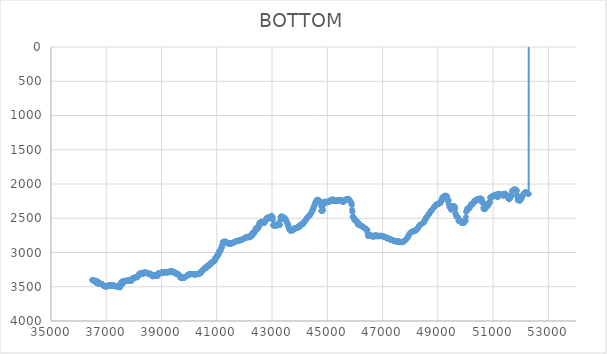
| Category | BOTTOM |
|---|---|
| 36490.3511 | 3402.52 |
| 36497.4849 | 3402.52 |
| 36507.7244 | 3402.52 |
| 36517.9645 | 3402.52 |
| 36528.2046 | 3402.56 |
| 36538.4447 | 3404.14 |
| 36548.6848 | 3412.41 |
| 36558.9249 | 3414.06 |
| 36569.165 | 3424.77 |
| 36579.4051 | 3413.79 |
| 36589.6452 | 3413.85 |
| 36599.8853 | 3416.64 |
| 36610.1254 | 3418.04 |
| 36620.3655 | 3419.21 |
| 36630.6056 | 3411.76 |
| 36640.8457 | 3443.41 |
| 36651.0857 | 3446.2 |
| 36661.3258 | 3447.57 |
| 36671.5659 | 3447.16 |
| 36681.806 | 3430.44 |
| 36692.0461 | 3421.62 |
| 36702.2862 | 3452.75 |
| 36712.5263 | 3435.38 |
| 36722.7664 | 3454.61 |
| 36733.0065 | 3454.57 |
| 36743.2466 | 3453.23 |
| 36753.4867 | 3454.33 |
| 36763.7268 | 3443.66 |
| 36773.9669 | 3456.01 |
| 36784.207 | 3456.05 |
| 36794.4471 | 3457.42 |
| 36804.6871 | 3457.49 |
| 36814.9272 | 3460.24 |
| 36825.1673 | 3460.31 |
| 36835.4074 | 3463.05 |
| 36845.6475 | 3463.12 |
| 36855.8876 | 3465.9 |
| 36866.1277 | 3467.62 |
| 36876.3678 | 3481.35 |
| 36886.6079 | 3481.52 |
| 36896.848 | 3488.29 |
| 36907.0881 | 3484.2 |
| 36917.3282 | 3485.64 |
| 36927.5683 | 3488.39 |
| 36937.8084 | 3488.46 |
| 36948.0484 | 3491.24 |
| 36958.2885 | 3492.68 |
| 36968.5286 | 3495.46 |
| 36978.7687 | 3496.87 |
| 36989.0088 | 3498.35 |
| 36999.2489 | 3502.22 |
| 37009.489 | 3492.65 |
| 37019.7291 | 3493.92 |
| 37029.9692 | 3489.76 |
| 37040.2093 | 3488.35 |
| 37050.4494 | 3486.95 |
| 37060.6895 | 3485.57 |
| 37070.9296 | 3485.54 |
| 37081.1697 | 3484.17 |
| 37091.4097 | 3484.13 |
| 37101.6498 | 3482.72 |
| 37111.8899 | 3481.35 |
| 37122.13 | 3481.32 |
| 37132.3701 | 3479.94 |
| 37142.6102 | 3479.94 |
| 37152.8503 | 3479.94 |
| 37163.0904 | 3479.94 |
| 37173.3305 | 3479.94 |
| 37183.5706 | 3479.98 |
| 37193.8107 | 3481.35 |
| 37204.0508 | 3481.35 |
| 37214.2909 | 3481.39 |
| 37224.531 | 3482.76 |
| 37234.771 | 3482.76 |
| 37245.0111 | 3482.72 |
| 37255.2512 | 3481.42 |
| 37265.4913 | 3484.13 |
| 37275.7314 | 3482.76 |
| 37285.9715 | 3482.76 |
| 37296.2116 | 3482.94 |
| 37306.4517 | 3489.83 |
| 37316.6918 | 3491.24 |
| 37326.9319 | 3492.51 |
| 37337.172 | 3488.42 |
| 37347.4121 | 3489.83 |
| 37357.6522 | 3491.24 |
| 37367.8923 | 3492.61 |
| 37378.1323 | 3492.9 |
| 37388.3724 | 3503.63 |
| 37398.6125 | 3493.98 |
| 37408.8526 | 3492.61 |
| 37419.0927 | 3492.68 |
| 37429.3328 | 3495.5 |
| 37439.5729 | 3498.28 |
| 37449.813 | 3499.72 |
| 37460.0531 | 3502.5 |
| 37470.2932 | 3503.94 |
| 37480.5333 | 3506.72 |
| 37490.7734 | 3508.13 |
| 37501.0135 | 3508.15 |
| 37511.2536 | 3455.87 |
| 37521.4936 | 3450.45 |
| 37531.7337 | 3453.2 |
| 37541.9738 | 3452.59 |
| 37552.2139 | 3429.23 |
| 37562.454 | 3427.83 |
| 37572.6941 | 3426.45 |
| 37582.9342 | 3427.17 |
| 37593.1743 | 3454.64 |
| 37603.4144 | 3455.19 |
| 37613.6545 | 3423.64 |
| 37623.8946 | 3423.64 |
| 37634.1347 | 3423.64 |
| 37644.3748 | 3423.64 |
| 37654.6149 | 3423.39 |
| 37664.8549 | 3413.79 |
| 37675.095 | 3413.79 |
| 37685.3351 | 3413.82 |
| 37695.5752 | 3415.19 |
| 37705.8153 | 3415.19 |
| 37716.0554 | 3415.16 |
| 37726.2955 | 3413.79 |
| 37736.5356 | 3413.75 |
| 37746.7757 | 3412.34 |
| 37757.0158 | 3410.97 |
| 37767.2559 | 3411.01 |
| 37777.496 | 3412.31 |
| 37787.7361 | 3409.56 |
| 37797.9762 | 3409.56 |
| 37808.2162 | 3409.6 |
| 37818.4563 | 3410.97 |
| 37828.6964 | 3410.97 |
| 37838.9365 | 3410.79 |
| 37849.1766 | 3404.08 |
| 37859.4167 | 3409.31 |
| 37869.6568 | 3399.67 |
| 37879.8969 | 3398.27 |
| 37890.137 | 3396.79 |
| 37900.3771 | 3393.32 |
| 37910.6172 | 3417.25 |
| 37920.8573 | 3388.38 |
| 37931.0974 | 3385.63 |
| 37941.3375 | 3385.6 |
| 37951.5775 | 3384.04 |
| 37961.8176 | 3377.15 |
| 37972.0577 | 3375.71 |
| 37982.2978 | 3372.96 |
| 37992.5379 | 3373.04 |
| 38002.778 | 3375.6 |
| 38013.0181 | 3368.71 |
| 38023.2582 | 3367.3 |
| 38033.4983 | 3365.89 |
| 38043.7384 | 3364.48 |
| 38053.9785 | 3363.08 |
| 38064.2186 | 3361.67 |
| 38074.4587 | 3360.3 |
| 38084.6987 | 3360.26 |
| 38094.9388 | 3358.74 |
| 38105.1789 | 3353.4 |
| 38115.419 | 3359 |
| 38125.6591 | 3362.97 |
| 38135.8992 | 3356.97 |
| 38146.1393 | 3337.77 |
| 38156.3794 | 3337.63 |
| 38166.6195 | 3332.11 |
| 38176.8596 | 3330.77 |
| 38187.0997 | 3331.49 |
| 38197.3398 | 3306.92 |
| 38207.5799 | 3311.14 |
| 38217.82 | 3315.22 |
| 38228.06 | 3313.84 |
| 38238.3001 | 3313.59 |
| 38248.5402 | 3304.06 |
| 38258.7803 | 3306.77 |
| 38269.0204 | 3305.36 |
| 38279.2605 | 3304.03 |
| 38289.5006 | 3305.47 |
| 38299.7407 | 3308.21 |
| 38309.9808 | 3308.14 |
| 38320.2209 | 3305.55 |
| 38330.461 | 3311.07 |
| 38340.7011 | 3311.92 |
| 38350.9412 | 3292.88 |
| 38361.1813 | 3298.29 |
| 38371.4213 | 3295.55 |
| 38381.6614 | 3295.47 |
| 38391.9015 | 3292.73 |
| 38402.1416 | 3292.62 |
| 38412.3817 | 3288.66 |
| 38422.6218 | 3294.14 |
| 38432.8619 | 3294.18 |
| 38443.102 | 3295.69 |
| 38453.3421 | 3301.14 |
| 38463.5822 | 3299.77 |
| 38473.8223 | 3299.88 |
| 38484.0624 | 3303.99 |
| 38494.3025 | 3303.92 |
| 38504.5426 | 3301.32 |
| 38514.7826 | 3306.92 |
| 38525.0227 | 3311.1 |
| 38535.2628 | 3313.88 |
| 38545.5029 | 3315.14 |
| 38555.743 | 3311.1 |
| 38565.9831 | 3313.66 |
| 38576.2232 | 3306.96 |
| 38586.4633 | 3312.44 |
| 38596.7034 | 3312.33 |
| 38606.9435 | 3308.47 |
| 38617.1836 | 3318.18 |
| 38627.4237 | 3322.44 |
| 38637.6638 | 3328.07 |
| 38647.9038 | 3333.81 |
| 38658.1439 | 3343.52 |
| 38668.384 | 3347.63 |
| 38678.6241 | 3347.52 |
| 38688.8642 | 3343.37 |
| 38699.1043 | 3342 |
| 38709.3444 | 3341.92 |
| 38719.5845 | 3339.11 |
| 38729.8246 | 3336.33 |
| 38740.0647 | 3334.92 |
| 38750.3048 | 3333.55 |
| 38760.5449 | 3333.55 |
| 38770.785 | 3333.51 |
| 38781.0251 | 3332.14 |
| 38791.2651 | 3332.14 |
| 38801.5052 | 3332.14 |
| 38811.7453 | 3332.14 |
| 38821.9854 | 3332.37 |
| 38832.2255 | 3340.66 |
| 38842.4656 | 3343.4 |
| 38852.7057 | 3342.51 |
| 38862.9458 | 3309.58 |
| 38873.1859 | 3308.18 |
| 38883.426 | 3306.77 |
| 38893.6661 | 3305.36 |
| 38903.9062 | 3303.99 |
| 38914.1463 | 3304.07 |
| 38924.3864 | 3306.69 |
| 38934.6264 | 3302.58 |
| 38944.8665 | 3302.58 |
| 38955.1066 | 3302.58 |
| 38965.3467 | 3302.62 |
| 38975.5868 | 3303.95 |
| 38985.8269 | 3302.25 |
| 38996.067 | 3289.95 |
| 39006.3071 | 3291.32 |
| 39016.5472 | 3291.36 |
| 39026.7873 | 3292.62 |
| 39037.0274 | 3288.66 |
| 39047.2675 | 3294.03 |
| 39057.5076 | 3289.95 |
| 39067.7476 | 3291.32 |
| 39077.9877 | 3291.32 |
| 39088.2278 | 3291.32 |
| 39098.4679 | 3291.17 |
| 39108.708 | 3285.65 |
| 39118.9481 | 3284.28 |
| 39129.1882 | 3284.47 |
| 39139.4283 | 3291.21 |
| 39149.6684 | 3286.99 |
| 39159.9085 | 3283.03 |
| 39170.1486 | 3288.58 |
| 39180.3887 | 3291.32 |
| 39190.6288 | 3291.32 |
| 39200.8689 | 3291.25 |
| 39211.1089 | 3288.51 |
| 39221.349 | 3288.55 |
| 39231.5891 | 3289.76 |
| 39241.8292 | 3284.17 |
| 39252.0693 | 3280.21 |
| 39262.3094 | 3285.62 |
| 39272.5495 | 3282.73 |
| 39282.7896 | 3277.4 |
| 39293.0297 | 3283.03 |
| 39303.2698 | 3288.47 |
| 39313.5099 | 3287.02 |
| 39323.75 | 3284.13 |
| 39333.9901 | 3278.54 |
| 39344.2301 | 3274.32 |
| 39354.4702 | 3270.21 |
| 39364.7103 | 3270.29 |
| 39374.9504 | 3273.02 |
| 39385.1905 | 3273.02 |
| 39395.4306 | 3273.44 |
| 39405.6707 | 3288.55 |
| 39415.9108 | 3289.76 |
| 39426.1509 | 3284.32 |
| 39436.391 | 3285.77 |
| 39446.6311 | 3288.47 |
| 39456.8712 | 3287.25 |
| 39467.1113 | 3292.62 |
| 39477.3514 | 3288.51 |
| 39487.5914 | 3288.62 |
| 39497.8315 | 3293.08 |
| 39508.0716 | 3305.48 |
| 39518.3117 | 3308.33 |
| 39528.5518 | 3312.4 |
| 39538.7919 | 3310.91 |
| 39549.032 | 3306.85 |
| 39559.2721 | 3308.29 |
| 39569.5122 | 3311.07 |
| 39579.7523 | 3312.48 |
| 39589.9924 | 3314.04 |
| 39600.2325 | 3320.92 |
| 39610.4726 | 3322.21 |
| 39620.7126 | 3319.63 |
| 39630.9527 | 3325.26 |
| 39641.1928 | 3331.16 |
| 39651.4329 | 3346.37 |
| 39661.673 | 3352 |
| 39671.9131 | 3357.64 |
| 39682.1532 | 3363.23 |
| 39692.3933 | 3367.45 |
| 39702.6334 | 3371.56 |
| 39712.8735 | 3371.48 |
| 39723.1136 | 3368.9 |
| 39733.3537 | 3374.37 |
| 39743.5938 | 3374.06 |
| 39753.8338 | 3363.11 |
| 39764.0739 | 3363.23 |
| 39774.314 | 3367.33 |
| 39784.5541 | 3367.33 |
| 39794.7942 | 3367.33 |
| 39805.0343 | 3367.33 |
| 39815.2744 | 3367.33 |
| 39825.5145 | 3367.25 |
| 39835.7546 | 3364.28 |
| 39845.9947 | 3361.31 |
| 39856.2348 | 3358.34 |
| 39866.4749 | 3355.37 |
| 39876.715 | 3352.39 |
| 39886.9551 | 3349.42 |
| 39897.1951 | 3346.45 |
| 39907.4352 | 3343.48 |
| 39917.6753 | 3340.51 |
| 39927.9154 | 3337.49 |
| 39938.1555 | 3334.47 |
| 39948.3956 | 3331.46 |
| 39958.6357 | 3328.44 |
| 39968.8758 | 3325.42 |
| 39979.1159 | 3322.41 |
| 39989.356 | 3319.46 |
| 39999.5961 | 3318.86 |
| 40009.8362 | 3318.25 |
| 40020.0763 | 3317.65 |
| 40030.3163 | 3317.05 |
| 40040.5564 | 3316.44 |
| 40050.7965 | 3315.84 |
| 40061.0366 | 3315.25 |
| 40071.2767 | 3315.09 |
| 40081.5168 | 3314.94 |
| 40091.7569 | 3314.78 |
| 40101.997 | 3314.62 |
| 40112.2371 | 3314.47 |
| 40122.4772 | 3314.31 |
| 40132.7173 | 3314.15 |
| 40142.9574 | 3314 |
| 40153.1975 | 3314.04 |
| 40163.4375 | 3320.73 |
| 40173.6776 | 3315.25 |
| 40183.9177 | 3315.25 |
| 40194.1578 | 3315.57 |
| 40204.3979 | 3326.47 |
| 40214.638 | 3324.83 |
| 40224.8781 | 3315.25 |
| 40235.1182 | 3315.25 |
| 40245.3583 | 3315.29 |
| 40255.5984 | 3316.7 |
| 40265.8385 | 3317.99 |
| 40276.0786 | 3315.25 |
| 40286.3187 | 3315.13 |
| 40296.5588 | 3311.07 |
| 40306.7988 | 3312.44 |
| 40317.0389 | 3312.44 |
| 40327.279 | 3312.52 |
| 40337.5191 | 3315.25 |
| 40347.7592 | 3315.29 |
| 40357.9993 | 3316.15 |
| 40368.2394 | 3298.36 |
| 40378.4795 | 3298.32 |
| 40388.7196 | 3296.87 |
| 40398.9597 | 3294.26 |
| 40409.1998 | 3298.36 |
| 40419.4399 | 3298.24 |
| 40429.68 | 3294.18 |
| 40439.92 | 3294.75 |
| 40450.1601 | 3267.35 |
| 40460.4002 | 3265.91 |
| 40470.6403 | 3263.17 |
| 40480.8804 | 3263.05 |
| 40491.1205 | 3258.95 |
| 40501.3606 | 3258.95 |
| 40511.6007 | 3258.83 |
| 40521.8408 | 3254.25 |
| 40532.0809 | 3237.75 |
| 40542.321 | 3234.94 |
| 40552.5611 | 3232.04 |
| 40562.8012 | 3226.69 |
| 40573.0412 | 3230.84 |
| 40583.2813 | 3232.16 |
| 40593.5214 | 3230.76 |
| 40603.7615 | 3229.39 |
| 40614.0016 | 3228.71 |
| 40624.2417 | 3205.34 |
| 40634.4818 | 3201.32 |
| 40644.7219 | 3204.05 |
| 40654.962 | 3203.93 |
| 40665.2021 | 3199.91 |
| 40675.4422 | 3202.6 |
| 40685.6823 | 3201.08 |
| 40695.9224 | 3195.09 |
| 40706.1624 | 3177.31 |
| 40716.4025 | 3177.23 |
| 40726.6426 | 3174.65 |
| 40736.8827 | 3180.08 |
| 40747.1228 | 3178.67 |
| 40757.3629 | 3177.35 |
| 40767.603 | 3178.55 |
| 40777.8431 | 3172.56 |
| 40788.0832 | 3154.74 |
| 40798.3233 | 3153.22 |
| 40808.5634 | 3147.63 |
| 40818.8035 | 3143.48 |
| 40829.0436 | 3141.96 |
| 40839.2836 | 3136.61 |
| 40849.5237 | 3140.75 |
| 40859.7638 | 3142 |
| 40870.0039 | 3137.57 |
| 40880.244 | 3126.47 |
| 40890.4841 | 3120.84 |
| 40900.7242 | 3115.45 |
| 40910.9643 | 3118.19 |
| 40921.2044 | 3118.31 |
| 40931.4445 | 3121.2 |
| 40941.6846 | 3080.18 |
| 40951.9247 | 3080.1 |
| 40962.1648 | 3077.41 |
| 40972.4048 | 3078.65 |
| 40982.6449 | 3074.59 |
| 40992.885 | 3075.19 |
| 41003.1251 | 3049.09 |
| 41013.3652 | 3045.11 |
| 41023.6053 | 3049.13 |
| 41033.8454 | 3045.43 |
| 41044.0855 | 3012.78 |
| 41054.3256 | 3018.37 |
| 41064.5657 | 3022.31 |
| 41074.8058 | 3017 |
| 41085.0459 | 3021.09 |
| 41095.286 | 2974.61 |
| 41105.526 | 2974.61 |
| 41115.7661 | 2974.61 |
| 41126.0062 | 2974.65 |
| 41136.2463 | 2974.84 |
| 41146.4864 | 2935.32 |
| 41156.7265 | 2939.42 |
| 41166.9666 | 2939.26 |
| 41177.2067 | 2932.69 |
| 41187.4468 | 2895.86 |
| 41197.6869 | 2898.76 |
| 41207.927 | 2902.52 |
| 41218.1671 | 2845.11 |
| 41228.4072 | 2845.11 |
| 41238.6472 | 2845.07 |
| 41248.8873 | 2843.7 |
| 41259.1274 | 2843.66 |
| 41269.3675 | 2842.33 |
| 41279.6076 | 2843.74 |
| 41289.8477 | 2844.99 |
| 41300.0878 | 2840.93 |
| 41310.3279 | 2842.38 |
| 41320.568 | 2845.11 |
| 41330.8081 | 2845.27 |
| 41341.0482 | 2850.74 |
| 41351.2883 | 2850.78 |
| 41361.5284 | 2852.19 |
| 41371.7684 | 2853.64 |
| 41382.0085 | 2856.45 |
| 41392.2486 | 2859.27 |
| 41402.4887 | 2862.08 |
| 41412.7288 | 2864.9 |
| 41422.9689 | 2867.64 |
| 41433.209 | 2867.81 |
| 41443.4491 | 2867.99 |
| 41453.6892 | 2868.16 |
| 41463.9293 | 2868.34 |
| 41474.1694 | 2868.52 |
| 41484.4095 | 2868.69 |
| 41494.6496 | 2868.87 |
| 41504.8896 | 2869.01 |
| 41515.1297 | 2868.07 |
| 41525.3698 | 2867.13 |
| 41535.6099 | 2866.2 |
| 41545.85 | 2865.26 |
| 41556.0901 | 2864.32 |
| 41566.3302 | 2863.35 |
| 41576.5703 | 2861.28 |
| 41586.8104 | 2859.22 |
| 41597.0505 | 2857.15 |
| 41607.2906 | 2855.09 |
| 41617.5307 | 2853.02 |
| 41627.7708 | 2850.96 |
| 41638.0108 | 2848.9 |
| 41648.2509 | 2846.83 |
| 41658.491 | 2844.77 |
| 41668.7311 | 2842.7 |
| 41678.9712 | 2840.64 |
| 41689.2113 | 2838.57 |
| 41699.4514 | 2836.51 |
| 41709.6915 | 2834.44 |
| 41719.9316 | 2832.42 |
| 41730.1717 | 2831.8 |
| 41740.4118 | 2831.17 |
| 41750.6519 | 2830.55 |
| 41760.892 | 2829.92 |
| 41771.132 | 2829.29 |
| 41781.3721 | 2828.67 |
| 41791.6122 | 2828.04 |
| 41801.8523 | 2827.42 |
| 41812.0924 | 2826.76 |
| 41822.3325 | 2825.22 |
| 41832.5726 | 2823.67 |
| 41842.8127 | 2822.12 |
| 41853.0528 | 2820.57 |
| 41863.2929 | 2819.02 |
| 41873.533 | 2817.47 |
| 41883.7731 | 2815.93 |
| 41894.0132 | 2814.38 |
| 41904.2532 | 2812.83 |
| 41914.4933 | 2811.25 |
| 41924.7334 | 2808.82 |
| 41934.9735 | 2806.39 |
| 41945.2136 | 2803.96 |
| 41955.4537 | 2801.53 |
| 41965.6938 | 2799.1 |
| 41975.9339 | 2796.67 |
| 41986.174 | 2794.23 |
| 41996.4141 | 2791.8 |
| 42006.6542 | 2789.37 |
| 42016.8943 | 2786.94 |
| 42027.1343 | 2784.53 |
| 42037.3744 | 2782.89 |
| 42047.6145 | 2781.25 |
| 42057.8546 | 2779.61 |
| 42068.0947 | 2777.96 |
| 42078.3348 | 2776.32 |
| 42088.5749 | 2774.85 |
| 42098.815 | 2778.99 |
| 42109.0551 | 2780.23 |
| 42119.2952 | 2776.14 |
| 42129.5353 | 2776.14 |
| 42139.7754 | 2776.14 |
| 42150.0155 | 2775.72 |
| 42160.2555 | 2762.44 |
| 42170.4956 | 2774.77 |
| 42180.7357 | 2776.14 |
| 42190.9758 | 2776.14 |
| 42201.2159 | 2776.09 |
| 42211.456 | 2774.31 |
| 42221.6961 | 2760.61 |
| 42231.9362 | 2759.2 |
| 42242.1763 | 2757.84 |
| 42252.4164 | 2757.79 |
| 42262.6565 | 2755.46 |
| 42272.8966 | 2724.98 |
| 42283.1367 | 2753.76 |
| 42293.3767 | 2712.79 |
| 42303.6168 | 2712.75 |
| 42313.8569 | 2711.3 |
| 42324.097 | 2708.74 |
| 42334.3371 | 2714.2 |
| 42344.5772 | 2714.2 |
| 42354.8173 | 2714.2 |
| 42365.0574 | 2713.4 |
| 42375.2975 | 2687.41 |
| 42385.5376 | 2685.03 |
| 42395.7777 | 2653.2 |
| 42406.0178 | 2682.47 |
| 42416.2579 | 2657.47 |
| 42426.4979 | 2644.07 |
| 42436.738 | 2652.27 |
| 42446.9781 | 2651.55 |
| 42457.2182 | 2629.01 |
| 42467.4583 | 2650.86 |
| 42477.6984 | 2650.82 |
| 42487.9385 | 2649.37 |
| 42498.1786 | 2645.96 |
| 42508.4187 | 2624.03 |
| 42518.6588 | 2621.26 |
| 42528.8989 | 2618.36 |
| 42539.139 | 2569.13 |
| 42549.379 | 2566.36 |
| 42559.6191 | 2564.91 |
| 42569.8592 | 2562.31 |
| 42580.0993 | 2566.32 |
| 42590.3394 | 2563.54 |
| 42600.5795 | 2561.84 |
| 42610.8196 | 2550.96 |
| 42621.0597 | 2552.5 |
| 42631.2998 | 2558.17 |
| 42641.5399 | 2564.91 |
| 42651.78 | 2562.18 |
| 42662.0201 | 2562.18 |
| 42672.2602 | 2562.18 |
| 42682.5002 | 2562.14 |
| 42692.7403 | 2560.9 |
| 42702.9804 | 2564.78 |
| 42713.2205 | 2558.17 |
| 42723.4606 | 2564.99 |
| 42733.7007 | 2564.1 |
| 42743.9408 | 2535.69 |
| 42754.1809 | 2543.37 |
| 42764.421 | 2527.03 |
| 42774.6611 | 2527.75 |
| 42784.9012 | 2507.97 |
| 42795.1413 | 2528.82 |
| 42805.3814 | 2497.43 |
| 42815.6214 | 2497.38 |
| 42825.8615 | 2495.98 |
| 42836.1016 | 2494.66 |
| 42846.3417 | 2495.63 |
| 42856.5818 | 2483.91 |
| 42866.8219 | 2501.61 |
| 42877.062 | 2500.2 |
| 42887.3021 | 2498.75 |
| 42897.5422 | 2496.02 |
| 42907.7823 | 2495.98 |
| 42918.0224 | 2494.61 |
| 42928.2625 | 2494.74 |
| 42938.5025 | 2498.79 |
| 42948.7426 | 2497.51 |
| 42958.9827 | 2500.24 |
| 42969.2228 | 2499.04 |
| 42979.4629 | 2462.17 |
| 42989.703 | 2504.55 |
| 42999.9431 | 2506.25 |
| 43010.1832 | 2473.84 |
| 43020.4233 | 2485.92 |
| 43030.6634 | 2525.14 |
| 43040.9035 | 2600.4 |
| 43051.1436 | 2607.22 |
| 43061.3837 | 2607.22 |
| 43071.6237 | 2607.22 |
| 43081.8638 | 2607.22 |
| 43092.1039 | 2607.35 |
| 43102.344 | 2611.14 |
| 43112.5841 | 2601.63 |
| 43122.8242 | 2603 |
| 43133.0643 | 2603.04 |
| 43143.3044 | 2604.62 |
| 43153.5445 | 2610.92 |
| 43163.7846 | 2594.47 |
| 43174.0247 | 2591.78 |
| 43184.2648 | 2593.1 |
| 43194.5048 | 2591.74 |
| 43204.7449 | 2591.78 |
| 43214.985 | 2593.1 |
| 43225.2251 | 2591.78 |
| 43235.4652 | 2593.19 |
| 43245.7053 | 2594.51 |
| 43255.9454 | 2593.23 |
| 43266.1855 | 2596 |
| 43276.4256 | 2597.41 |
| 43286.6657 | 2596.69 |
| 43296.9058 | 2529.73 |
| 43307.1459 | 2483.35 |
| 43317.386 | 2483.18 |
| 43327.626 | 2477.68 |
| 43337.8661 | 2476.31 |
| 43348.1062 | 2476.31 |
| 43358.3463 | 2476.31 |
| 43368.5864 | 2476.88 |
| 43378.8265 | 2494.83 |
| 43389.0666 | 2501.65 |
| 43399.3067 | 2501.65 |
| 43409.5468 | 2501.34 |
| 43419.7869 | 2491.8 |
| 43430.027 | 2491.75 |
| 43440.2671 | 2490.48 |
| 43450.5071 | 2493.47 |
| 43460.7472 | 2501.65 |
| 43470.9873 | 2501.91 |
| 43481.2274 | 2510.71 |
| 43491.4675 | 2529.67 |
| 43501.7076 | 2525.88 |
| 43511.9477 | 2535.38 |
| 43522.1878 | 2544.88 |
| 43532.4279 | 2554.38 |
| 43542.668 | 2563.89 |
| 43552.9081 | 2573.75 |
| 43563.1482 | 2583.6 |
| 43573.3883 | 2593.45 |
| 43583.6283 | 2603.53 |
| 43593.8684 | 2620.42 |
| 43604.1085 | 2637.09 |
| 43614.3486 | 2646.94 |
| 43624.5887 | 2656.69 |
| 43634.8288 | 2663.02 |
| 43645.0689 | 2669.35 |
| 43655.309 | 2675.69 |
| 43665.5491 | 2681.78 |
| 43675.7892 | 2680.37 |
| 43686.0293 | 2678.97 |
| 43696.2694 | 2677.56 |
| 43706.5094 | 2676.02 |
| 43716.7495 | 2670.56 |
| 43726.9896 | 2670.87 |
| 43737.2297 | 2680.24 |
| 43747.4698 | 2674.65 |
| 43757.7099 | 2670.61 |
| 43767.95 | 2671.71 |
| 43778.1901 | 2663.39 |
| 43788.4302 | 2659.26 |
| 43798.6703 | 2657.85 |
| 43808.9104 | 2656 |
| 43819.1505 | 2641.36 |
| 43829.3905 | 2652.13 |
| 43839.6306 | 2648.04 |
| 43849.8707 | 2647.91 |
| 43860.1108 | 2643.82 |
| 43870.3509 | 2643.86 |
| 43880.591 | 2645.01 |
| 43890.8311 | 2638.19 |
| 43901.0712 | 2638.14 |
| 43911.3113 | 2636.69 |
| 43921.5514 | 2633.97 |
| 43931.7915 | 2633.92 |
| 43942.0316 | 2632.51 |
| 43952.2717 | 2631.11 |
| 43962.5117 | 2629.03 |
| 43972.7518 | 2607.89 |
| 43982.9919 | 2628.38 |
| 43993.232 | 2629.03 |
| 44003.4721 | 2607.31 |
| 44013.7122 | 2610.08 |
| 44023.9523 | 2611.13 |
| 44034.1924 | 2601.59 |
| 44044.4325 | 2601.15 |
| 44054.6726 | 2587.52 |
| 44064.9127 | 2587.52 |
| 44075.1528 | 2587.52 |
| 44085.3928 | 2587.52 |
| 44095.6329 | 2587.2 |
| 44105.873 | 2577.97 |
| 44116.1131 | 2587.34 |
| 44126.3532 | 2581.39 |
| 44136.5933 | 2566.24 |
| 44146.8334 | 2561.24 |
| 44157.0735 | 2556.23 |
| 44167.3136 | 2551.23 |
| 44177.5537 | 2546.22 |
| 44187.7938 | 2541.22 |
| 44198.0339 | 2536.21 |
| 44208.2739 | 2531.21 |
| 44218.514 | 2526.2 |
| 44228.7541 | 2521.15 |
| 44238.9942 | 2514.58 |
| 44249.2343 | 2508.01 |
| 44259.4744 | 2501.44 |
| 44269.7145 | 2494.87 |
| 44279.9546 | 2488.3 |
| 44290.1947 | 2481.82 |
| 44300.4348 | 2477.91 |
| 44310.6749 | 2474 |
| 44320.915 | 2470.09 |
| 44331.1551 | 2466.18 |
| 44341.3951 | 2462.27 |
| 44351.6352 | 2458.36 |
| 44361.8753 | 2454.45 |
| 44372.1154 | 2450.54 |
| 44382.3555 | 2446.52 |
| 44392.5956 | 2439.25 |
| 44402.8357 | 2431.98 |
| 44413.0758 | 2424.7 |
| 44423.3159 | 2417.43 |
| 44433.556 | 2410.16 |
| 44443.7961 | 2402.74 |
| 44454.0362 | 2391.01 |
| 44464.2762 | 2379.28 |
| 44474.5163 | 2367.66 |
| 44484.7564 | 2359.21 |
| 44494.9965 | 2350.76 |
| 44505.2366 | 2342.32 |
| 44515.4767 | 2333.75 |
| 44525.7168 | 2321.36 |
| 44535.9569 | 2308.97 |
| 44546.197 | 2296.59 |
| 44556.4371 | 2284.2 |
| 44566.6772 | 2271.98 |
| 44576.9173 | 2264.94 |
| 44587.1573 | 2257.91 |
| 44597.3974 | 2250.87 |
| 44607.6375 | 2243.83 |
| 44617.8776 | 2236.79 |
| 44628.1177 | 2230.03 |
| 44638.3578 | 2231.62 |
| 44648.5979 | 2233.2 |
| 44658.838 | 2234.78 |
| 44669.0781 | 2236.37 |
| 44679.3182 | 2237.95 |
| 44689.5583 | 2239.53 |
| 44699.7984 | 2241.12 |
| 44710.0384 | 2242.97 |
| 44720.2785 | 2252.59 |
| 44730.5186 | 2255.23 |
| 44740.7587 | 2252.64 |
| 44750.9988 | 2256.86 |
| 44761.2389 | 2262.77 |
| 44771.479 | 2319.62 |
| 44781.7191 | 2390.59 |
| 44791.9592 | 2394.67 |
| 44802.1993 | 2394.63 |
| 44812.4394 | 2393.26 |
| 44822.6795 | 2393.26 |
| 44832.9195 | 2392.72 |
| 44843.1596 | 2374.27 |
| 44853.3997 | 2310.62 |
| 44863.6398 | 2280.47 |
| 44873.8799 | 2274.8 |
| 44884.12 | 2268.03 |
| 44894.3601 | 2269.39 |
| 44904.6002 | 2268.98 |
| 44914.8403 | 2256.82 |
| 44925.0804 | 2259.72 |
| 44935.3205 | 2265.22 |
| 44945.5606 | 2266.67 |
| 44955.8007 | 2269.3 |
| 44966.0407 | 2266.62 |
| 44976.2808 | 2267.76 |
| 44986.5209 | 2260.95 |
| 44996.761 | 2260.9 |
| 45007.0011 | 2259.45 |
| 45017.2412 | 2256.77 |
| 45027.4813 | 2258.22 |
| 45037.7214 | 2260.95 |
| 45047.9615 | 2260.9 |
| 45058.2016 | 2259.36 |
| 45068.4417 | 2254 |
| 45078.6818 | 2256.73 |
| 45088.9218 | 2256.17 |
| 45099.1619 | 2239.83 |
| 45109.402 | 2239.83 |
| 45119.6421 | 2239.56 |
| 45129.8822 | 2231.3 |
| 45140.1223 | 2228.71 |
| 45150.3624 | 2232.98 |
| 45160.6025 | 2238.24 |
| 45170.8426 | 2232.89 |
| 45181.0827 | 2235.66 |
| 45191.3228 | 2236.83 |
| 45201.5629 | 2231.2 |
| 45211.8029 | 2225.76 |
| 45222.043 | 2226.5 |
| 45232.2831 | 2248.33 |
| 45242.5232 | 2249.5 |
| 45252.7633 | 2244.24 |
| 45263.0034 | 2249.64 |
| 45273.2435 | 2248.09 |
| 45283.4836 | 2242.74 |
| 45293.7237 | 2245.37 |
| 45303.9638 | 2242.65 |
| 45314.2039 | 2242.7 |
| 45324.444 | 2244.06 |
| 45334.684 | 2244.15 |
| 45344.9241 | 2246.69 |
| 45355.1642 | 2241.29 |
| 45365.4043 | 2242.65 |
| 45375.6444 | 2242.6 |
| 45385.8845 | 2241.24 |
| 45396.1246 | 2241.24 |
| 45406.3647 | 2241.2 |
| 45416.6048 | 2239.74 |
| 45426.8449 | 2237.02 |
| 45437.085 | 2236.83 |
| 45447.3251 | 2231.53 |
| 45457.5651 | 2235.52 |
| 45467.8052 | 2232.8 |
| 45478.0453 | 2232.89 |
| 45488.2854 | 2235.75 |
| 45498.5255 | 2239.83 |
| 45508.7656 | 2239.97 |
| 45519.0057 | 2244.24 |
| 45529.2458 | 2249.87 |
| 45539.4859 | 2255.46 |
| 45549.726 | 2259.45 |
| 45559.9661 | 2256.73 |
| 45570.2062 | 2256.87 |
| 45580.4462 | 2260.76 |
| 45590.6863 | 2255.13 |
| 45600.9264 | 2249.5 |
| 45611.1665 | 2244.1 |
| 45621.4066 | 2245.28 |
| 45631.6467 | 2239.69 |
| 45641.8868 | 2235.42 |
| 45652.1269 | 2229.98 |
| 45662.367 | 2229.89 |
| 45672.6071 | 2227.07 |
| 45682.8472 | 2224.26 |
| 45693.0873 | 2221.53 |
| 45703.3273 | 2221.39 |
| 45713.5674 | 2217.5 |
| 45723.8075 | 2222.9 |
| 45734.0476 | 2221.49 |
| 45744.2877 | 2220.22 |
| 45754.5278 | 2222.76 |
| 45764.7679 | 2217.31 |
| 45775.008 | 2217.64 |
| 45785.2481 | 2227.35 |
| 45795.4882 | 2232.89 |
| 45805.7283 | 2235.85 |
| 45815.9684 | 2242.88 |
| 45826.2084 | 2250.11 |
| 45836.4485 | 2262.4 |
| 45846.6886 | 2264 |
| 45856.9287 | 2270.94 |
| 45867.1688 | 2275.4 |
| 45877.4089 | 2286.9 |
| 45887.649 | 2306.98 |
| 45897.8891 | 2377.36 |
| 45908.1292 | 2408.48 |
| 45918.3693 | 2481.9 |
| 45928.6094 | 2480.54 |
| 45938.8495 | 2480.77 |
| 45949.0895 | 2487.57 |
| 45959.3296 | 2488.61 |
| 45969.5697 | 2518.07 |
| 45979.8098 | 2505.36 |
| 45990.0499 | 2531.21 |
| 46000.29 | 2531.21 |
| 46010.5301 | 2531.07 |
| 46020.7702 | 2526.99 |
| 46031.0103 | 2527.46 |
| 46041.2504 | 2541.06 |
| 46051.4905 | 2541.21 |
| 46061.7306 | 2545.48 |
| 46071.9706 | 2550.96 |
| 46082.2107 | 2552.14 |
| 46092.4508 | 2548.16 |
| 46102.6909 | 2590.33 |
| 46112.931 | 2589.48 |
| 46123.1711 | 2565.89 |
| 46133.4112 | 2591.93 |
| 46143.6513 | 2597.04 |
| 46153.8914 | 2587.85 |
| 46164.1315 | 2597.23 |
| 46174.3716 | 2593.48 |
| 46184.6116 | 2602.81 |
| 46194.8517 | 2597.46 |
| 46205.0918 | 2600.56 |
| 46215.3319 | 2611.44 |
| 46225.572 | 2611.49 |
| 46235.8121 | 2612.99 |
| 46246.0522 | 2617.12 |
| 46256.2923 | 2618.53 |
| 46266.5324 | 2619.94 |
| 46276.7725 | 2621.44 |
| 46287.0126 | 2625.62 |
| 46297.2527 | 2628.38 |
| 46307.4927 | 2629.79 |
| 46317.7328 | 2631.29 |
| 46327.9729 | 2635.47 |
| 46338.213 | 2638.33 |
| 46348.4531 | 2642.75 |
| 46358.6932 | 2652.22 |
| 46368.9333 | 2650.86 |
| 46379.1734 | 2651 |
| 46389.4135 | 2655.08 |
| 46399.6536 | 2655.18 |
| 46409.8937 | 2657.99 |
| 46420.1338 | 2660.81 |
| 46430.3738 | 2664.43 |
| 46440.6139 | 2689.7 |
| 46450.854 | 2675.53 |
| 46461.0941 | 2737.54 |
| 46471.3342 | 2760.22 |
| 46481.5743 | 2748.08 |
| 46491.8144 | 2750.8 |
| 46502.0545 | 2750.94 |
| 46512.2946 | 2754.97 |
| 46522.5347 | 2753.52 |
| 46532.7748 | 2750.65 |
| 46543.0149 | 2746.58 |
| 46553.2549 | 2746.67 |
| 46563.495 | 2749.44 |
| 46573.7351 | 2751.23 |
| 46583.9752 | 2763.47 |
| 46594.2153 | 2763.37 |
| 46604.4554 | 2760.65 |
| 46614.6955 | 2760.65 |
| 46624.9356 | 2760.46 |
| 46635.1757 | 2755.31 |
| 46645.4158 | 2763.47 |
| 46655.6559 | 2763.56 |
| 46665.896 | 2766.33 |
| 46676.136 | 2767.59 |
| 46686.3761 | 2764.49 |
| 46696.6162 | 2753.66 |
| 46706.8563 | 2754.97 |
| 46717.0964 | 2753.61 |
| 46727.3365 | 2753.61 |
| 46737.5766 | 2753.61 |
| 46747.8167 | 2753.95 |
| 46758.0568 | 2763.13 |
| 46768.2969 | 2753.95 |
| 46778.537 | 2763.18 |
| 46788.777 | 2755.02 |
| 46799.0171 | 2755.02 |
| 46809.2572 | 2755.07 |
| 46819.4973 | 2756.43 |
| 46829.7374 | 2756.48 |
| 46839.9775 | 2757.84 |
| 46850.2176 | 2757.84 |
| 46860.4577 | 2757.88 |
| 46870.6978 | 2759.49 |
| 46880.9379 | 2765.99 |
| 46891.178 | 2757.84 |
| 46901.4181 | 2757.84 |
| 46911.6581 | 2757.79 |
| 46921.8982 | 2756.43 |
| 46932.1383 | 2756.43 |
| 46942.3784 | 2756.57 |
| 46952.6185 | 2760.51 |
| 46962.8586 | 2756.62 |
| 46973.0987 | 2761.96 |
| 46983.3388 | 2759.24 |
| 46993.5789 | 2759.29 |
| 47003.819 | 2760.85 |
| 47014.0591 | 2766.28 |
| 47024.2992 | 2766.33 |
| 47034.5392 | 2767.74 |
| 47044.7793 | 2769.15 |
| 47055.0194 | 2770.51 |
| 47065.2595 | 2770.55 |
| 47075.4996 | 2772.06 |
| 47085.7397 | 2776.14 |
| 47095.9798 | 2776.14 |
| 47106.2199 | 2776.18 |
| 47116.46 | 2777.59 |
| 47126.7001 | 2779 |
| 47136.9402 | 2780.7 |
| 47147.1802 | 2790.21 |
| 47157.4203 | 2790.26 |
| 47167.6604 | 2791.62 |
| 47177.9005 | 2791.67 |
| 47188.1406 | 2793.03 |
| 47198.3807 | 2793.08 |
| 47208.6208 | 2794.48 |
| 47218.8609 | 2795.89 |
| 47229.101 | 2797.3 |
| 47239.3411 | 2798.76 |
| 47249.5812 | 2801.52 |
| 47259.8213 | 2803.08 |
| 47270.0613 | 2808.56 |
| 47280.3014 | 2810.02 |
| 47290.5415 | 2812.78 |
| 47300.7816 | 2814.19 |
| 47311.0217 | 2815.5 |
| 47321.2618 | 2814.2 |
| 47331.5019 | 2816 |
| 47341.742 | 2817.79 |
| 47351.9821 | 2819.58 |
| 47362.2222 | 2821.37 |
| 47372.4623 | 2823.16 |
| 47382.7023 | 2824.95 |
| 47392.9424 | 2826.74 |
| 47403.1825 | 2828.54 |
| 47413.4226 | 2830.33 |
| 47423.6627 | 2832.12 |
| 47433.9028 | 2833.87 |
| 47444.1429 | 2834.37 |
| 47454.383 | 2834.87 |
| 47464.6231 | 2835.37 |
| 47474.8632 | 2835.88 |
| 47485.1033 | 2836.38 |
| 47495.3434 | 2836.88 |
| 47505.5834 | 2837.38 |
| 47515.8235 | 2837.89 |
| 47526.0636 | 2838.39 |
| 47536.3037 | 2838.89 |
| 47546.5438 | 2839.4 |
| 47556.7839 | 2839.9 |
| 47567.024 | 2840.4 |
| 47577.2641 | 2840.91 |
| 47587.5042 | 2841.61 |
| 47597.7443 | 2842.32 |
| 47607.9844 | 2843.02 |
| 47618.2245 | 2843.73 |
| 47628.4645 | 2844.43 |
| 47638.7046 | 2845.13 |
| 47648.9447 | 2845.84 |
| 47659.1848 | 2846.54 |
| 47669.4249 | 2847.24 |
| 47679.665 | 2847.95 |
| 47689.9051 | 2848.65 |
| 47700.1452 | 2849.26 |
| 47710.3853 | 2847.29 |
| 47720.6254 | 2845.32 |
| 47730.8655 | 2843.35 |
| 47741.1055 | 2841.38 |
| 47751.3456 | 2839.41 |
| 47761.5857 | 2837.44 |
| 47771.8258 | 2835.47 |
| 47782.0659 | 2833.5 |
| 47792.306 | 2831.53 |
| 47802.5461 | 2829.47 |
| 47812.7862 | 2824.96 |
| 47823.0263 | 2820.46 |
| 47833.2664 | 2815.95 |
| 47843.5065 | 2811.45 |
| 47853.7466 | 2806.94 |
| 47863.9866 | 2802.44 |
| 47874.2267 | 2797.94 |
| 47884.4668 | 2793.43 |
| 47894.7069 | 2788.93 |
| 47904.947 | 2784.26 |
| 47915.1871 | 2775.25 |
| 47925.4272 | 2766.24 |
| 47935.6673 | 2757.24 |
| 47945.9074 | 2748.23 |
| 47956.1475 | 2739.34 |
| 47966.3876 | 2733.71 |
| 47976.6276 | 2728.08 |
| 47986.8677 | 2722.45 |
| 47997.1078 | 2716.82 |
| 48007.3479 | 2711.3 |
| 48017.588 | 2708.89 |
| 48027.8281 | 2706.47 |
| 48038.0682 | 2704.06 |
| 48048.3083 | 2701.65 |
| 48058.5484 | 2699.23 |
| 48068.7885 | 2696.82 |
| 48079.0286 | 2694.45 |
| 48089.2687 | 2693.16 |
| 48099.5087 | 2691.87 |
| 48109.7488 | 2690.58 |
| 48119.9889 | 2689.29 |
| 48130.229 | 2688 |
| 48140.4691 | 2686.71 |
| 48150.7092 | 2685.42 |
| 48160.9493 | 2684.13 |
| 48171.1894 | 2682.84 |
| 48181.4295 | 2681.54 |
| 48191.6696 | 2680.25 |
| 48201.9097 | 2678.87 |
| 48212.1497 | 2674.93 |
| 48222.3898 | 2670.99 |
| 48232.6299 | 2667.05 |
| 48242.87 | 2663.1 |
| 48253.1101 | 2659.06 |
| 48263.3502 | 2652.22 |
| 48273.5903 | 2645.39 |
| 48283.8304 | 2638.55 |
| 48294.0705 | 2631.71 |
| 48304.3106 | 2624.87 |
| 48314.5507 | 2618.04 |
| 48324.7908 | 2611.32 |
| 48335.0308 | 2607.98 |
| 48345.2709 | 2604.64 |
| 48355.511 | 2601.3 |
| 48365.7511 | 2597.95 |
| 48375.9912 | 2594.61 |
| 48386.2313 | 2591.27 |
| 48396.4714 | 2587.92 |
| 48406.7115 | 2584.58 |
| 48416.9516 | 2581.3 |
| 48427.1917 | 2578.01 |
| 48437.4318 | 2574.73 |
| 48447.6718 | 2571.44 |
| 48457.9119 | 2568.16 |
| 48468.152 | 2564.88 |
| 48478.3921 | 2561.59 |
| 48488.6322 | 2558.31 |
| 48498.8723 | 2554.85 |
| 48509.1124 | 2546.68 |
| 48519.3525 | 2538.52 |
| 48529.5926 | 2530.35 |
| 48539.8327 | 2522.19 |
| 48550.0728 | 2514.07 |
| 48560.3128 | 2507.03 |
| 48570.5529 | 2499.99 |
| 48580.793 | 2492.95 |
| 48591.0331 | 2485.91 |
| 48601.2732 | 2478.95 |
| 48611.5133 | 2474.02 |
| 48621.7534 | 2469.1 |
| 48631.9935 | 2464.17 |
| 48642.2336 | 2459.24 |
| 48652.4737 | 2454.32 |
| 48662.7138 | 2449.34 |
| 48672.9539 | 2443.01 |
| 48683.1939 | 2436.67 |
| 48693.434 | 2430.34 |
| 48703.6741 | 2424 |
| 48713.9142 | 2417.67 |
| 48724.1543 | 2411.33 |
| 48734.3944 | 2405 |
| 48744.6345 | 2398.67 |
| 48754.8746 | 2392.33 |
| 48765.1147 | 2386.05 |
| 48775.3548 | 2381.23 |
| 48785.5949 | 2376.4 |
| 48795.8349 | 2371.57 |
| 48806.075 | 2366.75 |
| 48816.3151 | 2361.92 |
| 48826.5552 | 2357.09 |
| 48836.7953 | 2352.25 |
| 48847.0354 | 2346.93 |
| 48857.2755 | 2341.61 |
| 48867.5156 | 2336.3 |
| 48877.7557 | 2330.98 |
| 48887.9958 | 2325.66 |
| 48898.2359 | 2320.34 |
| 48908.4759 | 2315.03 |
| 48918.716 | 2309.71 |
| 48928.9561 | 2304.51 |
| 48939.1962 | 2302.4 |
| 48949.4363 | 2300.28 |
| 48959.6764 | 2298.17 |
| 48969.9165 | 2296.06 |
| 48980.1566 | 2293.95 |
| 48990.3967 | 2291.86 |
| 49000.6368 | 2290.46 |
| 49010.8769 | 2289.05 |
| 49021.117 | 2287.64 |
| 49031.357 | 2286.23 |
| 49041.5971 | 2284.83 |
| 49051.8372 | 2283.42 |
| 49062.0773 | 2281.99 |
| 49072.3174 | 2279.87 |
| 49082.5575 | 2277.76 |
| 49092.7976 | 2275.65 |
| 49103.0377 | 2273.14 |
| 49113.2778 | 2260 |
| 49123.5179 | 2246.86 |
| 49133.758 | 2233.77 |
| 49143.998 | 2222.04 |
| 49154.2381 | 2210.31 |
| 49164.4782 | 2198.9 |
| 49174.7183 | 2195.77 |
| 49184.9584 | 2192.64 |
| 49195.1985 | 2189.51 |
| 49205.4386 | 2186.39 |
| 49215.6787 | 2183.26 |
| 49225.9188 | 2180.13 |
| 49236.1589 | 2177 |
| 49246.399 | 2173.87 |
| 49256.639 | 2170.9 |
| 49266.8791 | 2171.9 |
| 49277.1192 | 2172.91 |
| 49287.3593 | 2173.91 |
| 49297.5994 | 2174.92 |
| 49307.8395 | 2175.92 |
| 49318.0796 | 2176.93 |
| 49328.3197 | 2177.95 |
| 49338.5598 | 2181.69 |
| 49348.7999 | 2244.06 |
| 49359.04 | 2243.54 |
| 49369.28 | 2229.98 |
| 49379.5201 | 2230.5 |
| 49389.7602 | 2246.13 |
| 49400.0003 | 2300.36 |
| 49410.2404 | 2301.5 |
| 49420.4805 | 2331.64 |
| 49430.7206 | 2339.77 |
| 49440.9607 | 2339.67 |
| 49451.2008 | 2336.91 |
| 49461.4409 | 2337.06 |
| 49471.681 | 2375.85 |
| 49481.921 | 2361.31 |
| 49492.1611 | 2335.55 |
| 49502.4012 | 2335.34 |
| 49512.6413 | 2329.92 |
| 49522.8814 | 2329.87 |
| 49533.1215 | 2328.41 |
| 49543.3616 | 2325.7 |
| 49553.6017 | 2325.65 |
| 49563.8418 | 2324.29 |
| 49574.0819 | 2324.29 |
| 49584.322 | 2324.19 |
| 49594.5621 | 2321.94 |
| 49604.8021 | 2334.2 |
| 49615.0422 | 2336.49 |
| 49625.2823 | 2363.29 |
| 49635.5224 | 2425.85 |
| 49645.7625 | 2432.47 |
| 49656.0026 | 2463.7 |
| 49666.2427 | 2465.05 |
| 49676.4828 | 2465.63 |
| 49686.7229 | 2480.54 |
| 49696.963 | 2480.75 |
| 49707.2031 | 2486.17 |
| 49717.4431 | 2486.17 |
| 49727.6832 | 2486.22 |
| 49737.9233 | 2489.51 |
| 49748.1634 | 2539.66 |
| 49758.4035 | 2539.6 |
| 49768.6436 | 2537.88 |
| 49778.8837 | 2528.4 |
| 49789.1238 | 2528.45 |
| 49799.3639 | 2529.86 |
| 49809.604 | 2531.26 |
| 49819.8441 | 2533.61 |
| 49830.0841 | 2559.52 |
| 49840.3242 | 2563.59 |
| 49850.5643 | 2563.53 |
| 49860.8044 | 2562.18 |
| 49871.0445 | 2562.18 |
| 49881.2846 | 2562.39 |
| 49891.5247 | 2567.76 |
| 49901.7648 | 2566.3 |
| 49912.0049 | 2563.64 |
| 49922.245 | 2564.99 |
| 49932.4851 | 2565.05 |
| 49942.7251 | 2566.51 |
| 49952.9652 | 2568.01 |
| 49963.2053 | 2536.84 |
| 49973.4454 | 2537 |
| 49983.6855 | 2540.7 |
| 49993.9256 | 2531.53 |
| 50004.1657 | 2537.66 |
| 50014.4058 | 2483.27 |
| 50024.6459 | 2408.27 |
| 50034.886 | 2395.97 |
| 50045.1261 | 2393.26 |
| 50055.3661 | 2391.95 |
| 50065.6062 | 2358.13 |
| 50075.8463 | 2359.27 |
| 50086.0864 | 2354.17 |
| 50096.3265 | 2362.3 |
| 50106.5666 | 2362.24 |
| 50116.8067 | 2360.84 |
| 50127.0468 | 2359.48 |
| 50137.2869 | 2358.58 |
| 50147.527 | 2335.45 |
| 50157.7671 | 2332.68 |
| 50168.0071 | 2331.33 |
| 50178.2472 | 2330.64 |
| 50188.4873 | 2313.03 |
| 50198.7274 | 2312.24 |
| 50208.9675 | 2291.86 |
| 50219.2076 | 2290.51 |
| 50229.4477 | 2290.51 |
| 50239.6878 | 2290.46 |
| 50249.9279 | 2289.1 |
| 50260.168 | 2289.1 |
| 50270.4081 | 2289.15 |
| 50280.6481 | 2290.03 |
| 50290.8882 | 2277.57 |
| 50301.1283 | 2270.85 |
| 50311.3684 | 2271.15 |
| 50321.6085 | 2244 |
| 50331.8486 | 2242.7 |
| 50342.0887 | 2244.22 |
| 50352.3288 | 2248.28 |
| 50362.5689 | 2248.12 |
| 50372.809 | 2244.06 |
| 50383.0491 | 2243.79 |
| 50393.2891 | 2237.07 |
| 50403.5292 | 2237.84 |
| 50413.7693 | 2222.94 |
| 50424.0094 | 2222.94 |
| 50434.2495 | 2222.94 |
| 50444.4896 | 2222.94 |
| 50454.7297 | 2222.94 |
| 50464.9698 | 2223.05 |
| 50475.2099 | 2226.08 |
| 50485.45 | 2234.15 |
| 50495.6901 | 2232.16 |
| 50505.9301 | 2215.9 |
| 50516.1702 | 2215.85 |
| 50526.4103 | 2214.55 |
| 50536.6504 | 2215.74 |
| 50546.8905 | 2211.74 |
| 50557.1306 | 2213.2 |
| 50567.3707 | 2216.17 |
| 50577.6108 | 2222.73 |
| 50587.8509 | 2219.24 |
| 50598.091 | 2267.99 |
| 50608.3311 | 2267.67 |
| 50618.5711 | 2259.81 |
| 50628.8112 | 2266.69 |
| 50639.0513 | 2272.18 |
| 50649.2914 | 2343.5 |
| 50659.5315 | 2366.41 |
| 50669.7716 | 2363.7 |
| 50680.0117 | 2363.81 |
| 50690.2518 | 2366.36 |
| 50700.4919 | 2362.3 |
| 50710.732 | 2362.24 |
| 50720.9721 | 2359.44 |
| 50731.2121 | 2322.99 |
| 50741.4522 | 2325.54 |
| 50751.6923 | 2321.42 |
| 50761.9324 | 2319.8 |
| 50772.1725 | 2312.87 |
| 50782.4126 | 2308.91 |
| 50792.6527 | 2311.78 |
| 50802.8928 | 2315.9 |
| 50813.1329 | 2317.31 |
| 50823.373 | 2317.21 |
| 50833.6131 | 2280.49 |
| 50843.8531 | 2276.43 |
| 50854.0932 | 2276.38 |
| 50864.3333 | 2275.08 |
| 50874.5734 | 2275.57 |
| 50884.8135 | 2251.86 |
| 50895.0536 | 2200.37 |
| 50905.2937 | 2198.91 |
| 50915.5338 | 2195.93 |
| 50925.7739 | 2189.11 |
| 50936.014 | 2187.91 |
| 50946.2541 | 2191.97 |
| 50956.4941 | 2191.81 |
| 50966.7342 | 2187.7 |
| 50976.9743 | 2186.34 |
| 50987.2144 | 2185.86 |
| 50997.4545 | 2173.57 |
| 51007.6946 | 2170.75 |
| 51017.9347 | 2168.05 |
| 51028.1748 | 2168.15 |
| 51038.4149 | 2171.08 |
| 51048.655 | 2176.44 |
| 51058.8951 | 2174.76 |
| 51069.1351 | 2166.96 |
| 51079.3752 | 2174.98 |
| 51089.6153 | 2172.38 |
| 51099.8554 | 2174.16 |
| 51110.0955 | 2152.13 |
| 51120.3356 | 2176.76 |
| 51130.5757 | 2183.53 |
| 51140.8158 | 2183.58 |
| 51151.0559 | 2183.64 |
| 51161.296 | 2152.56 |
| 51171.5361 | 2187.81 |
| 51181.7761 | 2187.42 |
| 51192.0162 | 2144.77 |
| 51202.2563 | 2160.41 |
| 51212.4964 | 2145.58 |
| 51222.7365 | 2146.99 |
| 51232.9766 | 2148.77 |
| 51243.2167 | 2159.44 |
| 51253.4568 | 2155.38 |
| 51263.6969 | 2155.38 |
| 51273.937 | 2155.54 |
| 51284.1771 | 2159.65 |
| 51294.4171 | 2160.84 |
| 51304.6572 | 2156.84 |
| 51314.8973 | 2158.19 |
| 51325.1374 | 2158.3 |
| 51335.3775 | 2161.28 |
| 51345.6176 | 2168.05 |
| 51355.8577 | 2168.05 |
| 51366.0978 | 2167.12 |
| 51376.3379 | 2144.28 |
| 51386.578 | 2148.18 |
| 51396.818 | 2144.12 |
| 51407.0581 | 2144.12 |
| 51417.2982 | 2144.23 |
| 51427.5383 | 2146.82 |
| 51437.7784 | 2144.12 |
| 51448.0185 | 2144.12 |
| 51458.2586 | 2145.1 |
| 51468.4987 | 2169.56 |
| 51478.7388 | 2172.32 |
| 51488.9789 | 2173.51 |
| 51499.219 | 2170.38 |
| 51509.459 | 2193.33 |
| 51519.6991 | 2192.08 |
| 51529.9392 | 2194.84 |
| 51540.1793 | 2196.25 |
| 51550.4194 | 2197.82 |
| 51560.6595 | 2203.95 |
| 51570.8996 | 2221.53 |
| 51581.1397 | 2221.43 |
| 51591.3798 | 2218.5 |
| 51601.6199 | 2213.03 |
| 51611.86 | 2210.91 |
| 51622.1 | 2191.87 |
| 51632.3401 | 2189.05 |
| 51642.5802 | 2185.74 |
| 51652.8203 | 2170.86 |
| 51663.0604 | 2170.64 |
| 51673.3005 | 2162.92 |
| 51683.5406 | 2105.78 |
| 51693.7807 | 2097.83 |
| 51704.0208 | 2101.78 |
| 51714.2609 | 2098.69 |
| 51724.501 | 2089.11 |
| 51734.741 | 2086.29 |
| 51744.9811 | 2083.53 |
| 51755.2212 | 2082.4 |
| 51765.4613 | 2087.76 |
| 51775.7014 | 2086.24 |
| 51785.9415 | 2082.46 |
| 51796.1816 | 2088.89 |
| 51806.4217 | 2080.77 |
| 51816.6618 | 2081.05 |
| 51826.9019 | 2087.87 |
| 51837.142 | 2089.27 |
| 51847.382 | 2090.74 |
| 51857.6221 | 2096.03 |
| 51867.8622 | 2160.59 |
| 51878.1023 | 2187.03 |
| 51888.3424 | 2237.05 |
| 51898.5825 | 2203.24 |
| 51908.8226 | 2203.24 |
| 51919.0627 | 2204.62 |
| 51929.3028 | 2238.43 |
| 51939.5429 | 2238.21 |
| 51949.7829 | 2232.85 |
| 51960.023 | 2234.76 |
| 51970.2631 | 2247.62 |
| 51980.5032 | 2231.39 |
| 51990.7433 | 2230.72 |
| 52000.9834 | 2214.33 |
| 52011.2235 | 2210.27 |
| 52021.4636 | 2210.33 |
| 52031.7037 | 2210.35 |
| 52041.9438 | 2177.68 |
| 52052.1839 | 2172.21 |
| 52062.4239 | 2170.81 |
| 52072.664 | 2169.4 |
| 52082.9041 | 2168.05 |
| 52093.1442 | 2166.94 |
| 52103.3843 | 2140 |
| 52113.6244 | 2142.6 |
| 52123.8645 | 2139.95 |
| 52134.1046 | 2141.19 |
| 52144.3447 | 2138.1 |
| 52154.5848 | 2128.41 |
| 52164.8249 | 2122.89 |
| 52175.0649 | 2120.19 |
| 52185.305 | 2120.41 |
| 52195.5451 | 2125.82 |
| 52205.7852 | 2125.87 |
| 52216.0253 | 2127.39 |
| 52226.2654 | 2131.45 |
| 52236.5055 | 2131.56 |
| 52246.7456 | 2134.37 |
| 52256.9857 | 2137.13 |
| 52267.2258 | 2138.71 |
| 52277.4658 | 2144.17 |
| 52287.7056 | 2145.44 |
| 52294.8619 | -9999 |